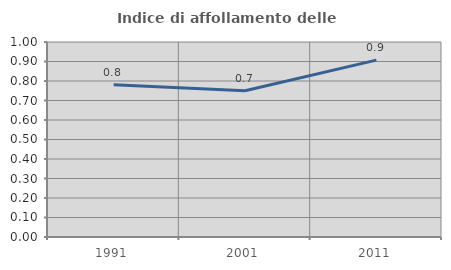
| Category | Indice di affollamento delle abitazioni  |
|---|---|
| 1991.0 | 0.781 |
| 2001.0 | 0.75 |
| 2011.0 | 0.907 |